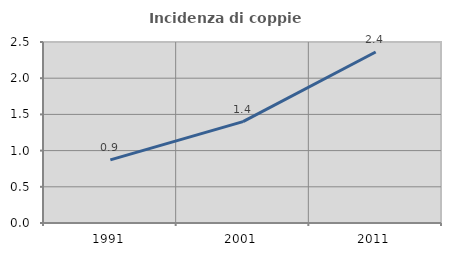
| Category | Incidenza di coppie miste |
|---|---|
| 1991.0 | 0.872 |
| 2001.0 | 1.399 |
| 2011.0 | 2.362 |